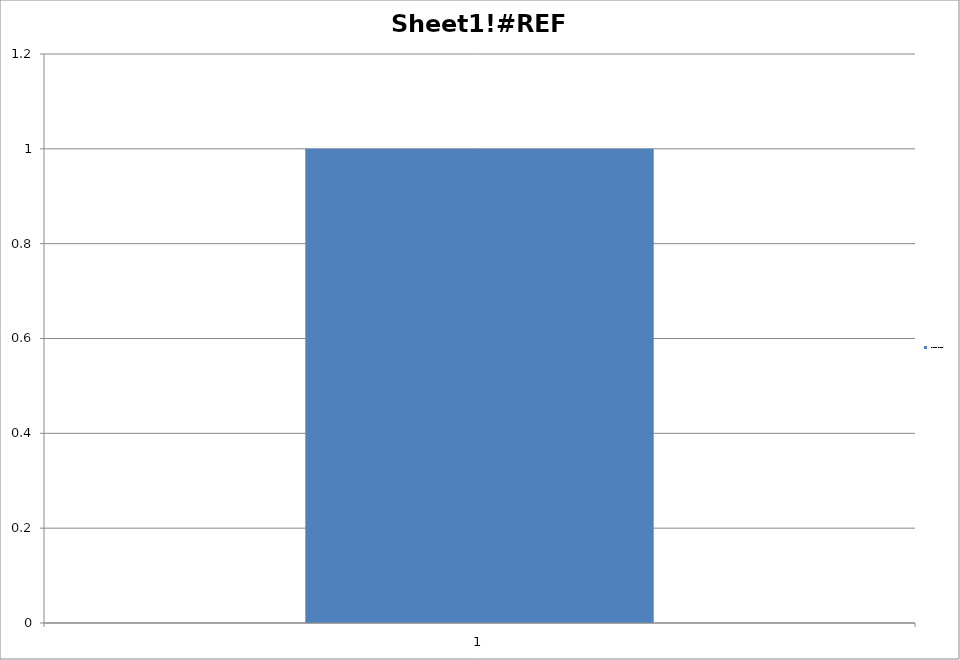
| Category | Sheet1!#REF! |
|---|---|
| 0 | 1 |